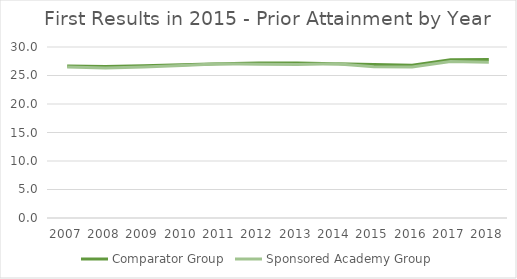
| Category | Comparator Group | Sponsored Academy Group |
|---|---|---|
| 2007.0 | 26.666 | 26.498 |
| 2008.0 | 26.564 | 26.307 |
| 2009.0 | 26.728 | 26.505 |
| 2010.0 | 26.868 | 26.755 |
| 2011.0 | 27.05 | 27.04 |
| 2012.0 | 27.191 | 26.986 |
| 2013.0 | 27.187 | 26.939 |
| 2014.0 | 27.072 | 27.046 |
| 2015.0 | 26.948 | 26.553 |
| 2016.0 | 26.79 | 26.506 |
| 2017.0 | 27.76 | 27.454 |
| 2018.0 | 27.806 | 27.336 |